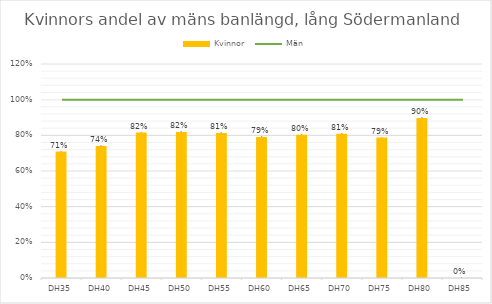
| Category | Kvinnor |
|---|---|
| DH35 | 0.709 |
| DH40 | 0.74 |
| DH45 | 0.815 |
| DH50 | 0.818 |
| DH55 | 0.813 |
| DH60 | 0.791 |
| DH65 | 0.803 |
| DH70 | 0.808 |
| DH75 | 0.788 |
| DH80 | 0.897 |
| DH85 | 0 |